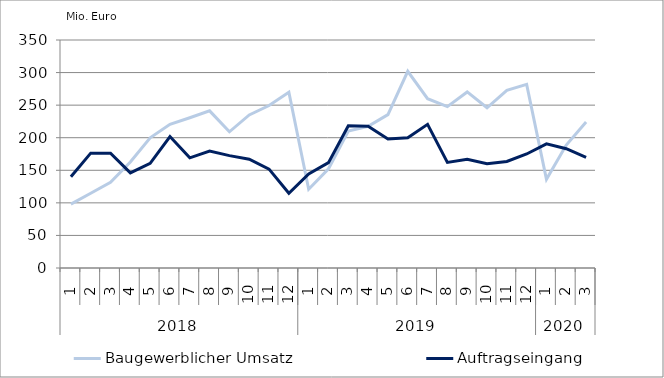
| Category | Baugewerblicher Umsatz | Auftragseingang |
|---|---|---|
| 0 | 97959.056 | 140119.385 |
| 1 | 114756.787 | 176330.213 |
| 2 | 131454.642 | 176241.061 |
| 3 | 162648.053 | 146063.407 |
| 4 | 199809.407 | 160551.931 |
| 5 | 220535.974 | 201835.846 |
| 6 | 230672.472 | 169132.23 |
| 7 | 241233.619 | 179396.293 |
| 8 | 209099.292 | 172542.764 |
| 9 | 234953.007 | 166991.729 |
| 10 | 249410.043 | 151835.629 |
| 11 | 269773.227 | 114807.456 |
| 12 | 120975.133 | 144510.881 |
| 13 | 152329.786 | 161685.201 |
| 14 | 210227.67 | 218455.879 |
| 15 | 217522.321 | 217610.064 |
| 16 | 235490.429 | 198110.439 |
| 17 | 301963.302 | 200012.086 |
| 18 | 259975.317 | 220559.061 |
| 19 | 247779.658 | 162059.723 |
| 20 | 270249.609 | 166829.611 |
| 21 | 245966.91 | 160120.773 |
| 22 | 272620.351 | 163589.389 |
| 23 | 281810.121 | 175051.247 |
| 24 | 136135.432 | 190647.086 |
| 25 | 188682.361 | 183141.14 |
| 26 | 224009.315 | 169770.009 |